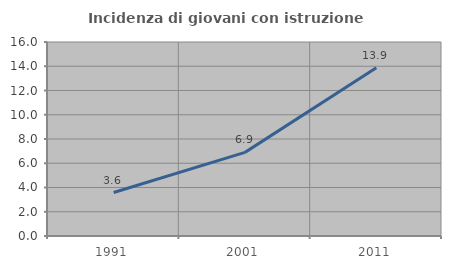
| Category | Incidenza di giovani con istruzione universitaria |
|---|---|
| 1991.0 | 3.587 |
| 2001.0 | 6.897 |
| 2011.0 | 13.878 |